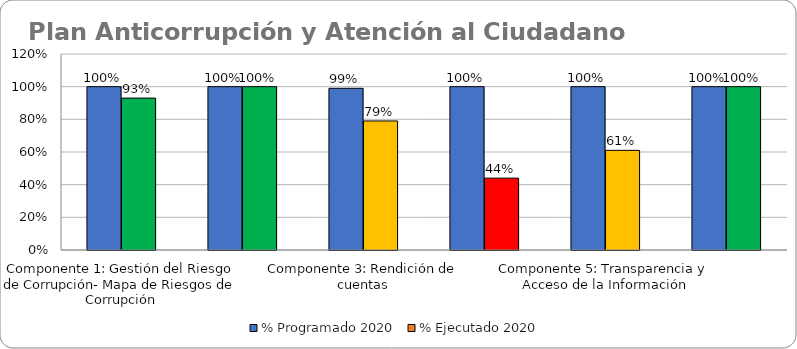
| Category | % Programado 2020 | % Ejecutado 2020 |
|---|---|---|
| Componente 1: Gestión del Riesgo de Corrupción- Mapa de Riesgos de Corrupción | 1 | 0.93 |
| Componente 2: Estratégia de Racionalización de Trámites | 1 | 1 |
| Componente 3: Rendición de cuentas | 0.99 | 0.79 |
| Componente 4: Atención al ciudadano | 1 | 0.44 |
| Componente 5: Transparencia y Acceso de la Información | 1 | 0.61 |
| Componente 6: Plan Gestión de la Integridad | 1 | 1 |